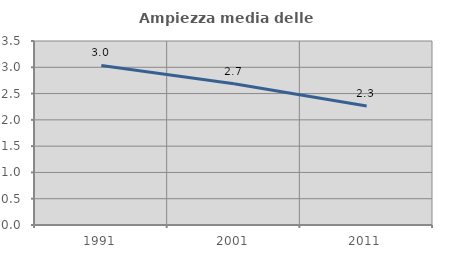
| Category | Ampiezza media delle famiglie |
|---|---|
| 1991.0 | 3.035 |
| 2001.0 | 2.686 |
| 2011.0 | 2.264 |